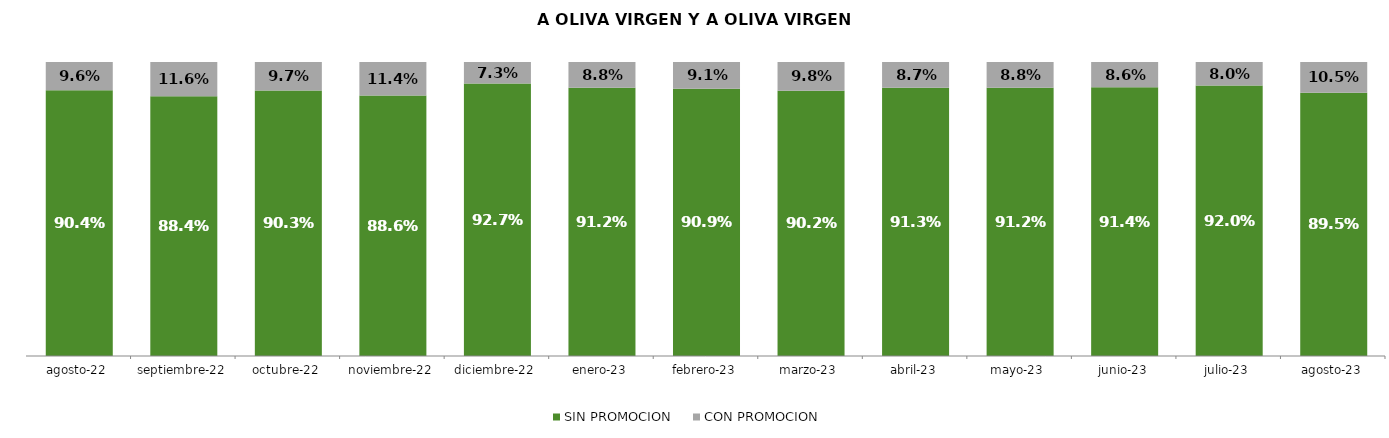
| Category | SIN PROMOCION   | CON PROMOCION   |
|---|---|---|
| 2022-08-01 | 0.904 | 0.096 |
| 2022-09-01 | 0.884 | 0.116 |
| 2022-10-01 | 0.903 | 0.097 |
| 2022-11-01 | 0.886 | 0.114 |
| 2022-12-01 | 0.927 | 0.073 |
| 2023-01-01 | 0.912 | 0.088 |
| 2023-02-01 | 0.909 | 0.091 |
| 2023-03-01 | 0.902 | 0.098 |
| 2023-04-01 | 0.913 | 0.087 |
| 2023-05-01 | 0.912 | 0.088 |
| 2023-06-01 | 0.914 | 0.086 |
| 2023-07-01 | 0.92 | 0.08 |
| 2023-08-01 | 0.895 | 0.105 |